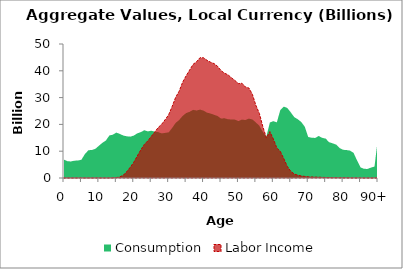
| Category | Consumption | Labor Income |
|---|---|---|
| 0 | 6877.238 | 0 |
|  | 6230.821 | 0.232 |
| 2 | 6185.251 | 0 |
| 3 | 6469.486 | 0 |
| 4 | 6517.303 | 0.258 |
| 5 | 6820.729 | 0 |
| 6 | 8954.693 | 0.294 |
| 7 | 10360.886 | 0.27 |
| 8 | 10460.063 | 0.402 |
| 9 | 10899.805 | 0.381 |
| 10 | 12016.304 | 0.452 |
| 11 | 13135.046 | 1.377 |
| 12 | 13970.114 | 3.009 |
| 13 | 15873.698 | 11.965 |
| 14 | 16158.466 | 42.499 |
| 15 | 16953.759 | 141.205 |
| 16 | 16441.333 | 397.724 |
| 17 | 15842.204 | 1056.611 |
| 18 | 15557.423 | 2360.712 |
| 19 | 15432.395 | 4028.331 |
| 20 | 15823.749 | 5865.525 |
| 21 | 16661.711 | 8197.762 |
| 22 | 17109.04 | 10458.033 |
| 23 | 17816.987 | 12477.162 |
| 24 | 17401.234 | 13827.225 |
| 25 | 17620.633 | 15506.858 |
| 26 | 17295.703 | 17134.722 |
| 27 | 17125.315 | 18841.407 |
| 28 | 16645.384 | 20067.466 |
| 29 | 16835.691 | 21785.836 |
| 30 | 17031.56 | 23593.074 |
| 31 | 18683.051 | 26701.135 |
| 32 | 20554.839 | 30087.58 |
| 33 | 21642.634 | 32377.02 |
| 34 | 23142.261 | 35712.685 |
| 35 | 24226.195 | 38118.061 |
| 36 | 24702.414 | 40256.608 |
| 37 | 25421.98 | 42401.888 |
| 38 | 25201.853 | 43391.666 |
| 39 | 25528.916 | 44905.058 |
| 40 | 25132.679 | 44861.002 |
| 41 | 24379.888 | 43898.097 |
| 42 | 24056.292 | 43206.668 |
| 43 | 23598.603 | 42692.41 |
| 44 | 23152.764 | 41713.686 |
| 45 | 22187.443 | 40093.618 |
| 46 | 22289.297 | 39114.876 |
| 47 | 21922.935 | 38510.399 |
| 48 | 21832.614 | 37383.244 |
| 49 | 21775.968 | 36377.3 |
| 50 | 21239.683 | 35231.75 |
| 51 | 21791.795 | 35354.815 |
| 52 | 21636.979 | 33977.223 |
| 53 | 22164.164 | 33566.786 |
| 54 | 21842.955 | 31220.808 |
| 55 | 20744.497 | 27105.881 |
| 56 | 19461.063 | 24083.891 |
| 57 | 17218.83 | 19124.838 |
| 58 | 15478.567 | 15003.352 |
| 59 | 20700.314 | 17322.972 |
| 60 | 21210.441 | 14551.909 |
| 61 | 20761.787 | 11216.64 |
| 62 | 25355.798 | 9921.574 |
| 63 | 26635.967 | 7225.355 |
| 64 | 26138.602 | 4356.405 |
| 65 | 24483.48 | 2486.322 |
| 66 | 22702.542 | 1494.544 |
| 67 | 21930.603 | 1037.42 |
| 68 | 20902.502 | 764.503 |
| 69 | 19171.809 | 594.075 |
| 70 | 15292.756 | 432.261 |
| 71 | 15036.648 | 397.287 |
| 72 | 14948.386 | 335.623 |
| 73 | 15671.815 | 300.643 |
| 74 | 14992.37 | 231.74 |
| 75 | 14689.757 | 188.526 |
| 76 | 13354.204 | 167.983 |
| 77 | 12941.051 | 127.778 |
| 78 | 12455.899 | 122.44 |
| 79 | 11194.181 | 97.242 |
| 80 | 10529.729 | 84.58 |
| 81 | 10421.622 | 58.207 |
| 82 | 10208.324 | 46.628 |
| 83 | 9367.643 | 30.892 |
| 84 | 6533.165 | 16.772 |
| 85 | 3957.008 | 7.383 |
| 86 | 3413.992 | 0 |
| 87 | 3393.619 | 0 |
| 88 | 3883.839 | 0 |
| 89 | 4266.348 | 0 |
| 90+ | 15038.372 | 0 |